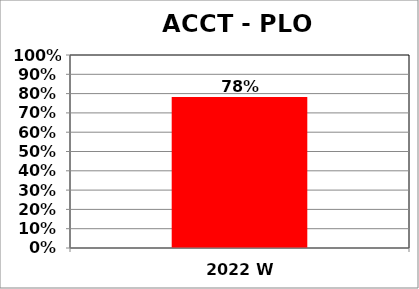
| Category | Series 0 |
|---|---|
| 2022 W | 0.783 |